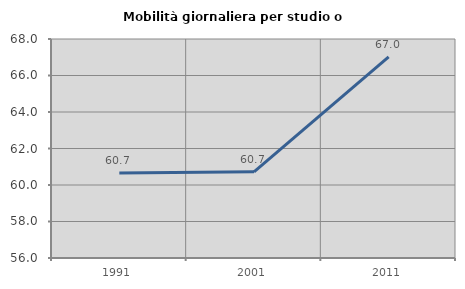
| Category | Mobilità giornaliera per studio o lavoro |
|---|---|
| 1991.0 | 60.661 |
| 2001.0 | 60.72 |
| 2011.0 | 67.023 |